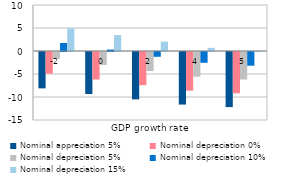
| Category | Nominal appreciation 5% | Nominal depreciation 0% | Nominal depreciation 5% | Nominal depreciation 10% | Nominal depreciation 15% |
|---|---|---|---|---|---|
| -2.0 | -7.905 | -4.694 | -1.482 | 1.73 | 4.942 |
| 0.0 | -9.126 | -5.978 | -2.831 | 0.317 | 3.465 |
| 2.0 | -10.298 | -7.213 | -4.127 | -1.041 | 2.045 |
| 4.0 | -11.426 | -8.399 | -5.373 | -2.346 | 0.68 |
| 5.0 | -11.974 | -8.976 | -5.978 | -2.981 | 0.017 |